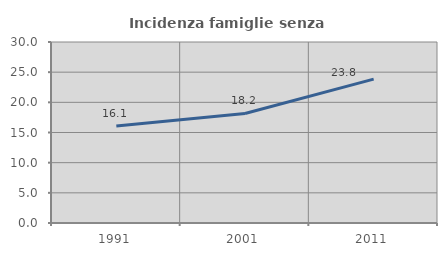
| Category | Incidenza famiglie senza nuclei |
|---|---|
| 1991.0 | 16.061 |
| 2001.0 | 18.159 |
| 2011.0 | 23.846 |